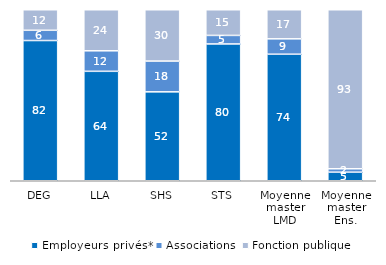
| Category | Employeurs privés* | Associations | Fonction publique |
|---|---|---|---|
| DEG | 82 | 6 | 12 |
| LLA | 64 | 12 | 24 |
| SHS | 52 | 18 | 30 |
| STS | 80 | 5 | 15 |
| Moyenne master LMD | 74 | 9 | 17 |
| Moyenne master Ens. | 5 | 2 | 93 |